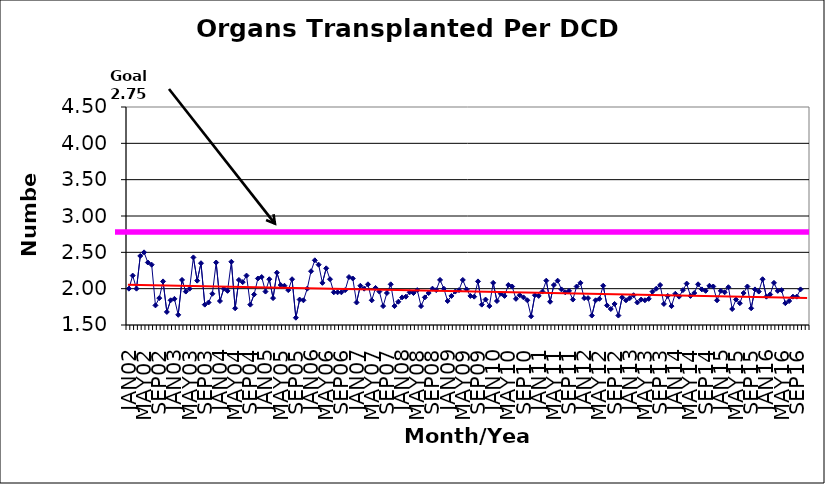
| Category | Series 0 |
|---|---|
| JAN02 | 2 |
| FEB02 | 2.18 |
| MAR02 | 2 |
| APR02 | 2.45 |
| MAY02 | 2.5 |
| JUN02 | 2.36 |
| JUL02 | 2.33 |
| AUG02 | 1.77 |
| SEP02 | 1.87 |
| OCT02 | 2.1 |
| NOV02 | 1.68 |
| DEC02 | 1.84 |
| JAN03 | 1.86 |
| FEB03 | 1.64 |
| MAR03 | 2.12 |
| APR03 | 1.96 |
| MAY03 | 2 |
| JUN03 | 2.43 |
| JUL03 | 2.11 |
| AUG03 | 2.35 |
| SEP03 | 1.78 |
| OCT03 | 1.81 |
| NOV03 | 1.93 |
| DEC03 | 2.36 |
| JAN04 | 1.83 |
| FEB04 | 2 |
| MAR04 | 1.97 |
| APR04 | 2.37 |
| MAY04 | 1.73 |
| JUN04 | 2.12 |
| JUL04 | 2.09 |
| AUG04 | 2.18 |
| SEP04 | 1.78 |
| OCT04 | 1.92 |
| NOV04 | 2.14 |
| DEC04 | 2.16 |
| JAN05 | 1.96 |
| FEB05 | 2.13 |
| MAR05 | 1.87 |
| APR05 | 2.22 |
| MAY05 | 2.05 |
| JUN05 | 2.04 |
| JUL05 | 1.98 |
| AUG05 | 2.13 |
| SEP05 | 1.6 |
| OCT05 | 1.85 |
| NOV05 | 1.84 |
| DEC05 | 2 |
| JAN06 | 2.24 |
| FEB06 | 2.39 |
| MAR06 | 2.33 |
| APR06 | 2.08 |
| MAY06 | 2.28 |
| JUN06 | 2.13 |
| JUL06 | 1.95 |
| AUG06 | 1.95 |
| SEP06 | 1.95 |
| OCT06 | 1.98 |
| NOV06 | 2.16 |
| DEC06 | 2.14 |
| JAN07 | 1.81 |
| FEB07 | 2.04 |
| MAR07 | 2 |
| APR07 | 2.06 |
| MAY07 | 1.84 |
| JUN07 | 2.01 |
| JUL07 | 1.96 |
| AUG07 | 1.76 |
| SEP07 | 1.94 |
| OCT07 | 2.06 |
| NOV07 | 1.76 |
| DEC07 | 1.82 |
| JAN08 | 1.88 |
| FEB08 | 1.89 |
| MAR08 | 1.95 |
| APR08 | 1.94 |
| MAY08 | 1.98 |
| JUN08 | 1.76 |
| JUL08 | 1.88 |
| AUG08 | 1.94 |
| SEP08 | 2 |
| OCT08 | 1.98 |
| NOV08 | 2.12 |
| DEC08 | 2 |
| JAN09 | 1.83 |
| FEB09 | 1.9 |
| MAR09 | 1.96 |
| APR09 | 1.98 |
| MAY09 | 2.12 |
| JUN09 | 1.99 |
| JUL09 | 1.9 |
| AUG09 | 1.89 |
| SEP09 | 2.1 |
| OCT09 | 1.78 |
| NOV09 | 1.85 |
| DEC09 | 1.76 |
| JAN10 | 2.08 |
| FEB10 | 1.83 |
| MAR10 | 1.93 |
| APR10 | 1.9 |
| MAY10 | 2.05 |
| JUN10 | 2.03 |
| JUL10 | 1.86 |
| AUG10 | 1.91 |
| SEP10 | 1.88 |
| OCT10 | 1.84 |
| NOV10 | 1.62 |
| DEC10 | 1.91 |
| JAN11 | 1.9 |
| FEB11 | 1.96 |
| MAR11 | 2.11 |
| APR11 | 1.82 |
| MAY11 | 2.05 |
| JUN11 | 2.11 |
| JUL11 | 1.99 |
| AUG11 | 1.95 |
| SEP11 | 1.97 |
| OCT11 | 1.85 |
| NOV11 | 2.03 |
| DEC11 | 2.08 |
| JAN12 | 1.87 |
| FEB12 | 1.87 |
| MAR12 | 1.63 |
| APR12 | 1.84 |
| MAY12 | 1.86 |
| JUN12 | 2.04 |
| JUL12 | 1.77 |
| AUG12 | 1.72 |
| SEP12 | 1.79 |
| OCT12 | 1.63 |
| NOV12 | 1.88 |
| DEC12 | 1.84 |
| JAN13 | 1.87 |
| FEB13 | 1.91 |
| MAR13 | 1.81 |
| APR13 | 1.85 |
| MAY13 | 1.84 |
| JUN13 | 1.86 |
| JUL13 | 1.96 |
| AUG13 | 2 |
| SEP13 | 2.05 |
| OCT13 | 1.79 |
| NOV13 | 1.9 |
| DEC13 | 1.76 |
| JAN14 | 1.93 |
| FEB14 | 1.89 |
| MAR14 | 1.98 |
| APR14 | 2.07 |
| MAY14 | 1.9 |
| JUN14 | 1.94 |
| JUL14 | 2.06 |
| AUG14 | 1.99 |
| SEP14 | 1.97 |
| OCT14 | 2.04 |
| NOV14 | 2.03 |
| DEC14 | 1.84 |
| JAN15 | 1.97 |
| FEB15 | 1.95 |
| MAR15 | 2.02 |
| APR15 | 1.72 |
| MAY15 | 1.85 |
| JUN15 | 1.8 |
| JUL15 | 1.94 |
| AUG15 | 2.03 |
| SEP15 | 1.73 |
| OCT15 | 1.99 |
| NOV15 | 1.96 |
| DEC15 | 2.13 |
| JAN16 | 1.89 |
| FEB16 | 1.92 |
| MAR16 | 2.08 |
| APR16 | 1.97 |
| MAY16 | 1.98 |
| JUN16 | 1.8 |
| JUL16 | 1.83 |
| AUG16 | 1.89 |
| SEP16 | 1.89 |
| OCT16 | 1.99 |